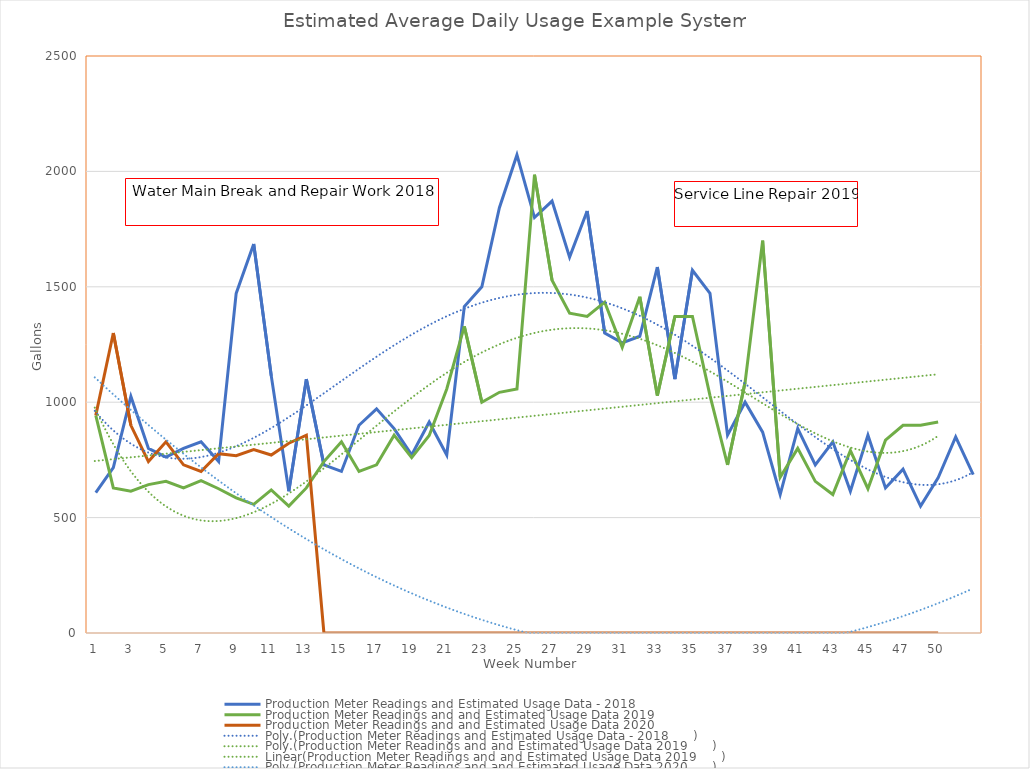
| Category | Production Meter Readings and Estimated Usage Data - 2018 | Production Meter Readings and and Estimated Usage Data 2019 | Production Meter Readings and and Estimated Usage Data 2020 |
|---|---|---|---|
| 1.0 | 608.571 | 942.857 | 942.857 |
| 2.0 | 716.667 | 628.571 | 1300 |
| 3.0 | 1025 | 614.286 | 900 |
| 4.0 | 800 | 642.857 | 742.857 |
| 5.0 | 762.5 | 657.143 | 828.571 |
| 6.0 | 800 | 628.571 | 728.571 |
| 7.0 | 828.571 | 660 | 700 |
| 8.0 | 742.857 | 625 | 777 |
| 9.0 | 1471.429 | 585.714 | 768.143 |
| 10.0 | 1685.714 | 557.143 | 795.143 |
| 11.0 | 1114.286 | 620 | 771.143 |
| 12.0 | 614.286 | 550 | 822.286 |
| 13.0 | 1100 | 628.571 | 857.286 |
| 14.0 | 728.571 | 742.857 | 0 |
| 15.0 | 700 | 828.571 | 0 |
| 16.0 | 900 | 700 | 0 |
| 17.0 | 971.429 | 728.571 | 0 |
| 18.0 | 885.714 | 857.143 | 0 |
| 19.0 | 771.429 | 760 | 0 |
| 20.0 | 914.286 | 855.556 | 0 |
| 21.0 | 771.429 | 1057.143 | 0 |
| 22.0 | 1414.286 | 1328.571 | 0 |
| 23.0 | 1500 | 1000 | 0 |
| 24.0 | 1842.857 | 1042.857 | 0 |
| 25.0 | 2071.429 | 1057.143 | 0 |
| 26.0 | 1800 | 1985.714 | 0 |
| 27.0 | 1871.429 | 1528.571 | 0 |
| 28.0 | 1628.571 | 1385.714 | 0 |
| 29.0 | 1828.571 | 1371.429 | 0 |
| 30.0 | 1300 | 1433.333 | 0 |
| 31.0 | 1257.143 | 1237.5 | 0 |
| 32.0 | 1285.714 | 1457.143 | 0 |
| 33.0 | 1585.714 | 1028.571 | 0 |
| 34.0 | 1100 | 1371.429 | 0 |
| 35.0 | 1571.429 | 1371.429 | 0 |
| 36.0 | 1471.429 | 1028.571 | 0 |
| 37.0 | 857.143 | 728.571 | 0 |
| 38.0 | 1000 | 1085.714 | 0 |
| 39.0 | 870 | 1700 | 0 |
| 40.0 | 600 | 675 | 0 |
| 41.0 | 885.714 | 800 | 0 |
| 42.0 | 728.571 | 657.143 | 0 |
| 43.0 | 828.571 | 600 | 0 |
| 44.0 | 614.286 | 790 | 0 |
| 45.0 | 857.143 | 625 | 0 |
| 46.0 | 628.571 | 835.714 | 0 |
| 47.0 | 710 | 900 | 0 |
| 49.0 | 550 | 900 | 0 |
| 50.0 | 672.727 | 914.286 | 0 |